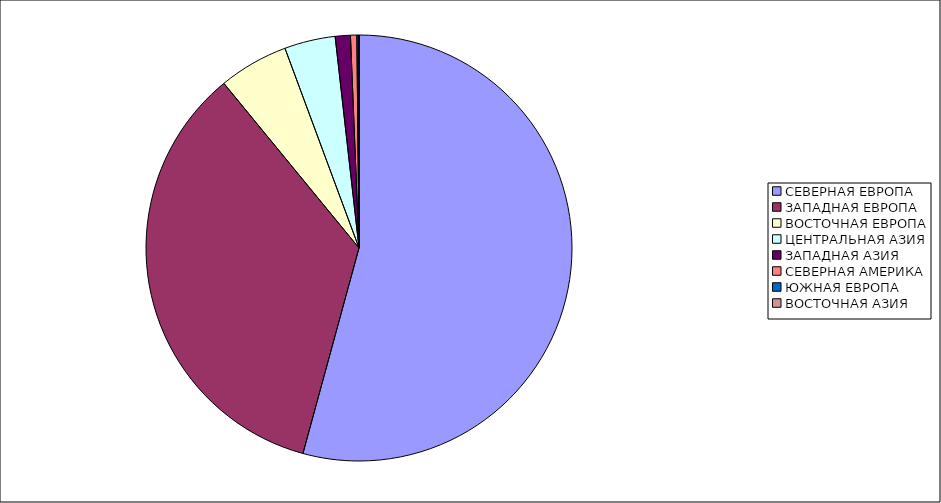
| Category | Оборот |
|---|---|
| СЕВЕРНАЯ ЕВРОПА | 54.24 |
| ЗАПАДНАЯ ЕВРОПА | 34.82 |
| ВОСТОЧНАЯ ЕВРОПА | 5.29 |
| ЦЕНТРАЛЬНАЯ АЗИЯ | 3.86 |
| ЗАПАДНАЯ АЗИЯ | 1.15 |
| СЕВЕРНАЯ АМЕРИКА | 0.48 |
| ЮЖНАЯ ЕВРОПА | 0.16 |
| ВОСТОЧНАЯ АЗИЯ | 0 |